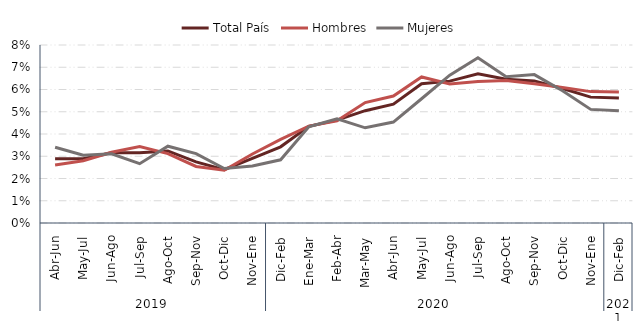
| Category | Total País | Hombres | Mujeres |
|---|---|---|---|
| 0 | 0.029 | 0.026 | 0.034 |
| 1 | 0.029 | 0.028 | 0.031 |
| 2 | 0.032 | 0.032 | 0.031 |
| 3 | 0.032 | 0.034 | 0.027 |
| 4 | 0.032 | 0.031 | 0.035 |
| 5 | 0.027 | 0.025 | 0.031 |
| 6 | 0.024 | 0.024 | 0.024 |
| 7 | 0.029 | 0.031 | 0.026 |
| 8 | 0.034 | 0.038 | 0.028 |
| 9 | 0.043 | 0.044 | 0.043 |
| 10 | 0.046 | 0.046 | 0.047 |
| 11 | 0.05 | 0.054 | 0.043 |
| 12 | 0.053 | 0.057 | 0.045 |
| 13 | 0.063 | 0.066 | 0.056 |
| 14 | 0.064 | 0.063 | 0.066 |
| 15 | 0.067 | 0.064 | 0.074 |
| 16 | 0.065 | 0.064 | 0.066 |
| 17 | 0.064 | 0.063 | 0.067 |
| 18 | 0.06 | 0.061 | 0.059 |
| 19 | 0.057 | 0.059 | 0.051 |
| 20 | 0.056 | 0.059 | 0.05 |